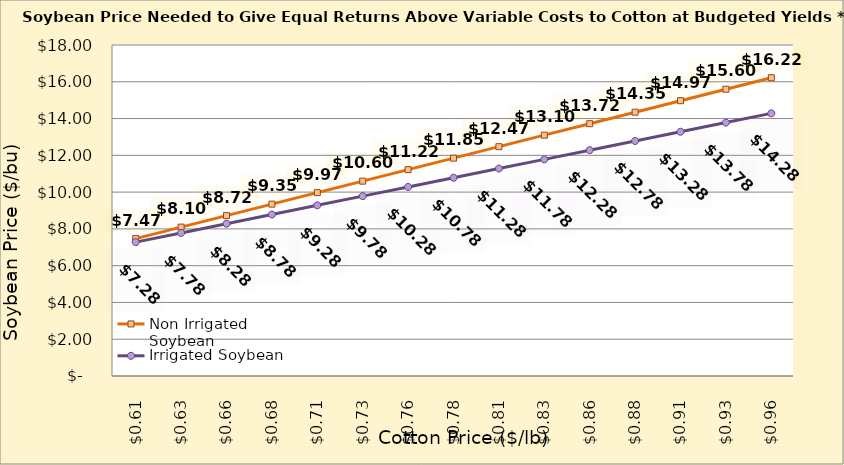
| Category | Non Irrigated Soybean | Irrigated Soybean |
|---|---|---|
| 0.6049999999999999 | 7.472 | 7.281 |
| 0.6299999999999999 | 8.097 | 7.781 |
| 0.6549999999999999 | 8.722 | 8.281 |
| 0.6799999999999999 | 9.347 | 8.781 |
| 0.705 | 9.972 | 9.281 |
| 0.73 | 10.597 | 9.781 |
| 0.755 | 11.222 | 10.281 |
| 0.78 | 11.847 | 10.781 |
| 0.805 | 12.472 | 11.281 |
| 0.8300000000000001 | 13.097 | 11.781 |
| 0.8550000000000001 | 13.722 | 12.281 |
| 0.8800000000000001 | 14.347 | 12.781 |
| 0.9050000000000001 | 14.972 | 13.281 |
| 0.9300000000000002 | 15.597 | 13.781 |
| 0.9550000000000002 | 16.222 | 14.281 |